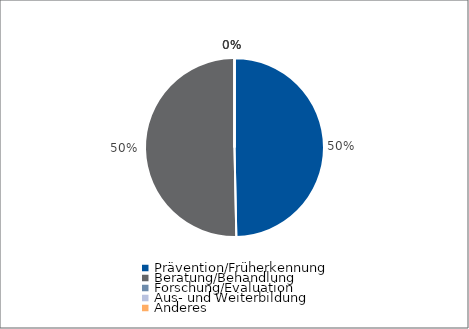
| Category | Series 0 |
|---|---|
| Prävention/Früherkennung | 78960.05 |
| Beratung/Behandlung | 80000 |
| Forschung/Evaluation | 0 |
| Aus- und Weiterbildung | 0 |
| Anderes | 0 |